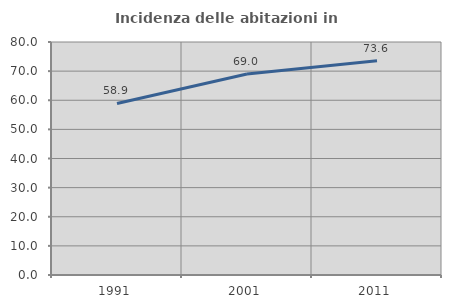
| Category | Incidenza delle abitazioni in proprietà  |
|---|---|
| 1991.0 | 58.906 |
| 2001.0 | 69.041 |
| 2011.0 | 73.576 |